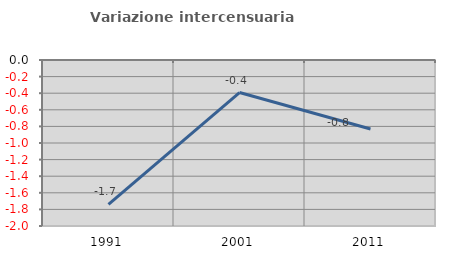
| Category | Variazione intercensuaria annua |
|---|---|
| 1991.0 | -1.739 |
| 2001.0 | -0.392 |
| 2011.0 | -0.832 |